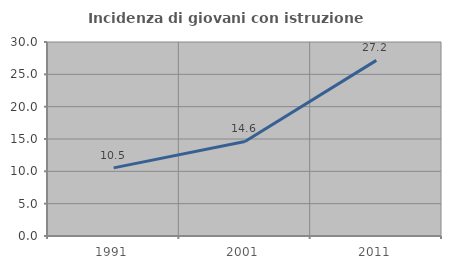
| Category | Incidenza di giovani con istruzione universitaria |
|---|---|
| 1991.0 | 10.535 |
| 2001.0 | 14.622 |
| 2011.0 | 27.158 |